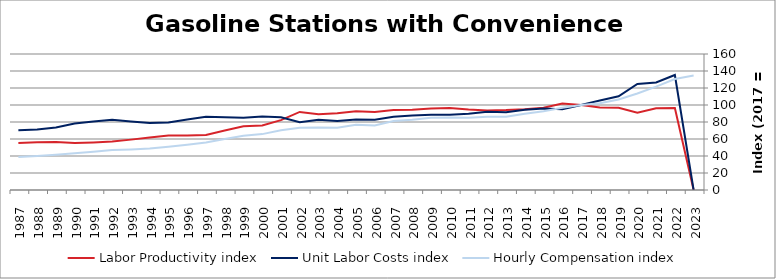
| Category | Labor Productivity index | Unit Labor Costs index | Hourly Compensation index |
|---|---|---|---|
| 2023.0 | 0 | 0 | 134.667 |
| 2022.0 | 96.473 | 135.312 | 130.54 |
| 2021.0 | 96.121 | 126.477 | 121.571 |
| 2020.0 | 90.951 | 124.794 | 113.502 |
| 2019.0 | 96.662 | 110.23 | 106.55 |
| 2018.0 | 97.031 | 105.253 | 102.128 |
| 2017.0 | 100 | 100 | 100 |
| 2016.0 | 101.778 | 95.035 | 96.724 |
| 2015.0 | 96.821 | 95.76 | 92.716 |
| 2014.0 | 95.1 | 94.409 | 89.783 |
| 2013.0 | 94.004 | 91.593 | 86.101 |
| 2012.0 | 93.542 | 91.992 | 86.051 |
| 2011.0 | 94.624 | 89.84 | 85.01 |
| 2010.0 | 96.497 | 88.463 | 85.364 |
| 2009.0 | 95.867 | 88.639 | 84.976 |
| 2008.0 | 94.356 | 87.586 | 82.642 |
| 2007.0 | 94.258 | 86.079 | 81.137 |
| 2006.0 | 91.909 | 82.714 | 76.021 |
| 2005.0 | 92.578 | 82.948 | 76.792 |
| 2004.0 | 90.329 | 81.183 | 73.332 |
| 2003.0 | 89.177 | 82.541 | 73.608 |
| 2002.0 | 91.837 | 79.795 | 73.281 |
| 2001.0 | 82.219 | 85.599 | 70.379 |
| 2000.0 | 75.961 | 86.564 | 65.755 |
| 1999.0 | 74.969 | 85.086 | 63.788 |
| 1998.0 | 70.014 | 85.517 | 59.873 |
| 1997.0 | 64.748 | 86.243 | 55.84 |
| 1996.0 | 64.244 | 82.862 | 53.234 |
| 1995.0 | 64.139 | 79.539 | 51.016 |
| 1994.0 | 61.836 | 78.772 | 48.709 |
| 1993.0 | 59.268 | 80.471 | 47.694 |
| 1992.0 | 56.958 | 82.536 | 47.011 |
| 1991.0 | 55.983 | 80.594 | 45.119 |
| 1990.0 | 55.218 | 78.103 | 43.127 |
| 1989.0 | 56.591 | 73.453 | 41.568 |
| 1988.0 | 56.157 | 71.311 | 40.046 |
| 1987.0 | 55.194 | 70.203 | 38.748 |